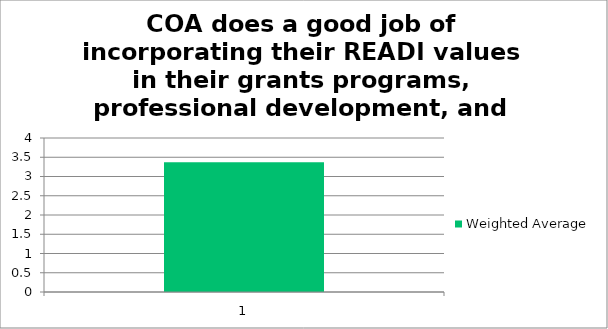
| Category | Weighted Average |
|---|---|
| 1.0 | 3.37 |